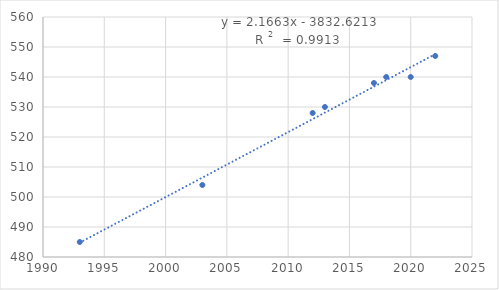
| Category | Series 0 |
|---|---|
| 1993.0 | 485 |
| 2003.0 | 504 |
| 2012.0 | 528 |
| 2013.0 | 530 |
| 2017.0 | 538 |
| 2018.0 | 540 |
| 2020.0 | 540 |
| 2022.0 | 547 |